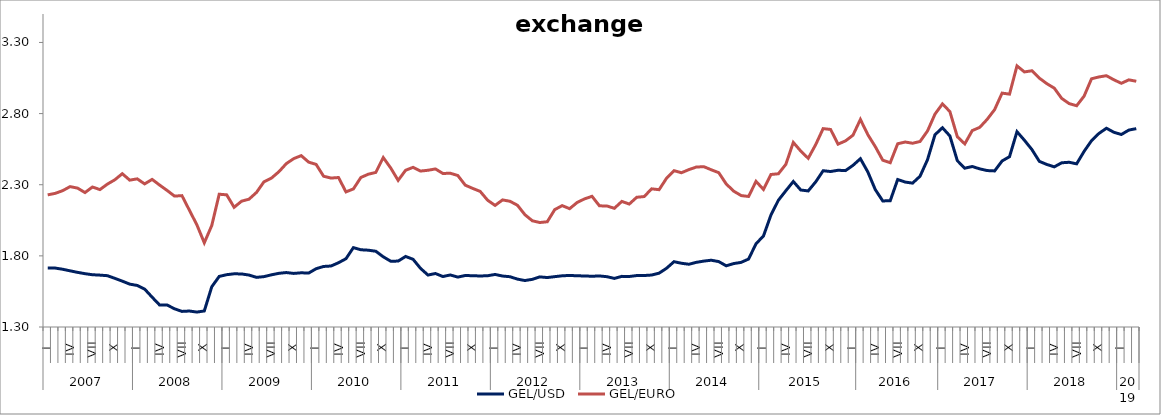
| Category | GEL/USD | GEL/EURO |
|---|---|---|
| 0 | 1.714 | 2.229 |
| 1 | 1.714 | 2.239 |
| 2 | 1.706 | 2.258 |
| 3 | 1.695 | 2.287 |
| 4 | 1.684 | 2.276 |
| 5 | 1.675 | 2.245 |
| 6 | 1.667 | 2.284 |
| 7 | 1.665 | 2.266 |
| 8 | 1.661 | 2.304 |
| 9 | 1.642 | 2.335 |
| 10 | 1.622 | 2.378 |
| 11 | 1.601 | 2.332 |
| 12 | 1.592 | 2.341 |
| 13 | 1.566 | 2.306 |
| 14 | 1.51 | 2.338 |
| 15 | 1.455 | 2.298 |
| 16 | 1.455 | 2.26 |
| 17 | 1.428 | 2.22 |
| 18 | 1.41 | 2.223 |
| 19 | 1.412 | 2.121 |
| 20 | 1.405 | 2.019 |
| 21 | 1.413 | 1.892 |
| 22 | 1.583 | 2.013 |
| 23 | 1.655 | 2.233 |
| 24 | 1.668 | 2.229 |
| 25 | 1.674 | 2.141 |
| 26 | 1.673 | 2.184 |
| 27 | 1.665 | 2.198 |
| 28 | 1.649 | 2.246 |
| 29 | 1.654 | 2.321 |
| 30 | 1.667 | 2.346 |
| 31 | 1.677 | 2.391 |
| 32 | 1.683 | 2.448 |
| 33 | 1.677 | 2.484 |
| 34 | 1.681 | 2.504 |
| 35 | 1.679 | 2.459 |
| 36 | 1.71 | 2.443 |
| 37 | 1.726 | 2.36 |
| 38 | 1.729 | 2.347 |
| 39 | 1.752 | 2.351 |
| 40 | 1.78 | 2.25 |
| 41 | 1.858 | 2.271 |
| 42 | 1.843 | 2.351 |
| 43 | 1.84 | 2.374 |
| 44 | 1.832 | 2.386 |
| 45 | 1.794 | 2.491 |
| 46 | 1.762 | 2.418 |
| 47 | 1.763 | 2.331 |
| 48 | 1.796 | 2.402 |
| 49 | 1.776 | 2.422 |
| 50 | 1.712 | 2.396 |
| 51 | 1.665 | 2.402 |
| 52 | 1.676 | 2.411 |
| 53 | 1.655 | 2.379 |
| 54 | 1.666 | 2.381 |
| 55 | 1.651 | 2.365 |
| 56 | 1.662 | 2.297 |
| 57 | 1.66 | 2.274 |
| 58 | 1.659 | 2.253 |
| 59 | 1.66 | 2.191 |
| 60 | 1.669 | 2.155 |
| 61 | 1.658 | 2.193 |
| 62 | 1.653 | 2.184 |
| 63 | 1.637 | 2.156 |
| 64 | 1.627 | 2.089 |
| 65 | 1.635 | 2.047 |
| 66 | 1.652 | 2.034 |
| 67 | 1.648 | 2.04 |
| 68 | 1.654 | 2.125 |
| 69 | 1.66 | 2.153 |
| 70 | 1.662 | 2.132 |
| 71 | 1.66 | 2.175 |
| 72 | 1.659 | 2.201 |
| 73 | 1.657 | 2.219 |
| 74 | 1.659 | 2.152 |
| 75 | 1.654 | 2.151 |
| 76 | 1.642 | 2.134 |
| 77 | 1.656 | 2.183 |
| 78 | 1.655 | 2.164 |
| 79 | 1.662 | 2.212 |
| 80 | 1.662 | 2.217 |
| 81 | 1.665 | 2.271 |
| 82 | 1.678 | 2.265 |
| 83 | 1.713 | 2.346 |
| 84 | 1.759 | 2.399 |
| 85 | 1.748 | 2.384 |
| 86 | 1.741 | 2.406 |
| 87 | 1.755 | 2.424 |
| 88 | 1.763 | 2.427 |
| 89 | 1.769 | 2.405 |
| 90 | 1.76 | 2.385 |
| 91 | 1.73 | 2.306 |
| 92 | 1.746 | 2.255 |
| 93 | 1.754 | 2.224 |
| 94 | 1.778 | 2.217 |
| 95 | 1.885 | 2.323 |
| 96 | 1.94 | 2.267 |
| 97 | 2.087 | 2.372 |
| 98 | 2.191 | 2.377 |
| 99 | 2.258 | 2.443 |
| 100 | 2.323 | 2.597 |
| 101 | 2.263 | 2.537 |
| 102 | 2.256 | 2.486 |
| 103 | 2.32 | 2.582 |
| 104 | 2.398 | 2.694 |
| 105 | 2.393 | 2.689 |
| 106 | 2.402 | 2.585 |
| 107 | 2.399 | 2.608 |
| 108 | 2.436 | 2.648 |
| 109 | 2.483 | 2.759 |
| 110 | 2.389 | 2.651 |
| 111 | 2.265 | 2.567 |
| 112 | 2.186 | 2.472 |
| 113 | 2.188 | 2.455 |
| 114 | 2.337 | 2.588 |
| 115 | 2.319 | 2.6 |
| 116 | 2.311 | 2.592 |
| 117 | 2.36 | 2.604 |
| 118 | 2.476 | 2.678 |
| 119 | 2.651 | 2.796 |
| 120 | 2.701 | 2.868 |
| 121 | 2.643 | 2.814 |
| 122 | 2.469 | 2.637 |
| 123 | 2.416 | 2.587 |
| 124 | 2.428 | 2.681 |
| 125 | 2.412 | 2.703 |
| 126 | 2.4 | 2.759 |
| 127 | 2.397 | 2.828 |
| 128 | 2.467 | 2.944 |
| 129 | 2.497 | 2.937 |
| 130 | 2.673 | 3.135 |
| 131 | 2.613 | 3.093 |
| 132 | 2.547 | 3.101 |
| 133 | 2.464 | 3.049 |
| 134 | 2.442 | 3.011 |
| 135 | 2.426 | 2.979 |
| 136 | 2.454 | 2.907 |
| 137 | 2.458 | 2.87 |
| 138 | 2.447 | 2.855 |
| 139 | 2.534 | 2.923 |
| 140 | 2.61 | 3.045 |
| 141 | 2.661 | 3.058 |
| 142 | 2.697 | 3.066 |
| 143 | 2.669 | 3.037 |
| 144 | 2.653 | 3.013 |
| 145 | 2.684 | 3.037 |
| 146 | 2.694 | 3.027 |